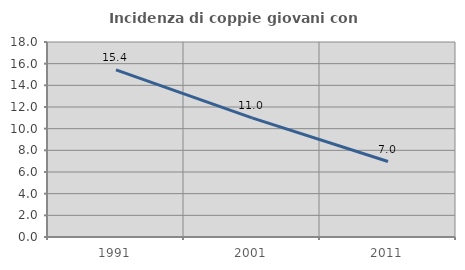
| Category | Incidenza di coppie giovani con figli |
|---|---|
| 1991.0 | 15.433 |
| 2001.0 | 10.995 |
| 2011.0 | 6.967 |